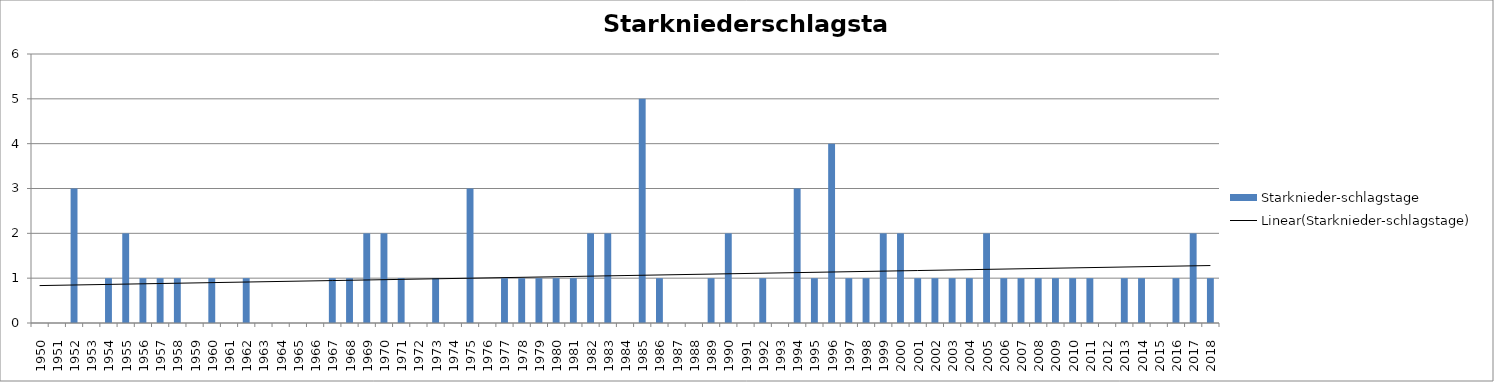
| Category | Starknieder-schlagstage |
|---|---|
| 1950.0 | 0 |
| 1951.0 | 0 |
| 1952.0 | 3 |
| 1953.0 | 0 |
| 1954.0 | 1 |
| 1955.0 | 2 |
| 1956.0 | 1 |
| 1957.0 | 1 |
| 1958.0 | 1 |
| 1959.0 | 0 |
| 1960.0 | 1 |
| 1961.0 | 0 |
| 1962.0 | 1 |
| 1963.0 | 0 |
| 1964.0 | 0 |
| 1965.0 | 0 |
| 1966.0 | 0 |
| 1967.0 | 1 |
| 1968.0 | 1 |
| 1969.0 | 2 |
| 1970.0 | 2 |
| 1971.0 | 1 |
| 1972.0 | 0 |
| 1973.0 | 1 |
| 1974.0 | 0 |
| 1975.0 | 3 |
| 1976.0 | 0 |
| 1977.0 | 1 |
| 1978.0 | 1 |
| 1979.0 | 1 |
| 1980.0 | 1 |
| 1981.0 | 1 |
| 1982.0 | 2 |
| 1983.0 | 2 |
| 1984.0 | 0 |
| 1985.0 | 5 |
| 1986.0 | 1 |
| 1987.0 | 0 |
| 1988.0 | 0 |
| 1989.0 | 1 |
| 1990.0 | 2 |
| 1991.0 | 0 |
| 1992.0 | 1 |
| 1993.0 | 0 |
| 1994.0 | 3 |
| 1995.0 | 1 |
| 1996.0 | 4 |
| 1997.0 | 1 |
| 1998.0 | 1 |
| 1999.0 | 2 |
| 2000.0 | 2 |
| 2001.0 | 1 |
| 2002.0 | 1 |
| 2003.0 | 1 |
| 2004.0 | 1 |
| 2005.0 | 2 |
| 2006.0 | 1 |
| 2007.0 | 1 |
| 2008.0 | 1 |
| 2009.0 | 1 |
| 2010.0 | 1 |
| 2011.0 | 1 |
| 2012.0 | 0 |
| 2013.0 | 1 |
| 2014.0 | 1 |
| 2015.0 | 0 |
| 2016.0 | 1 |
| 2017.0 | 2 |
| 2018.0 | 1 |